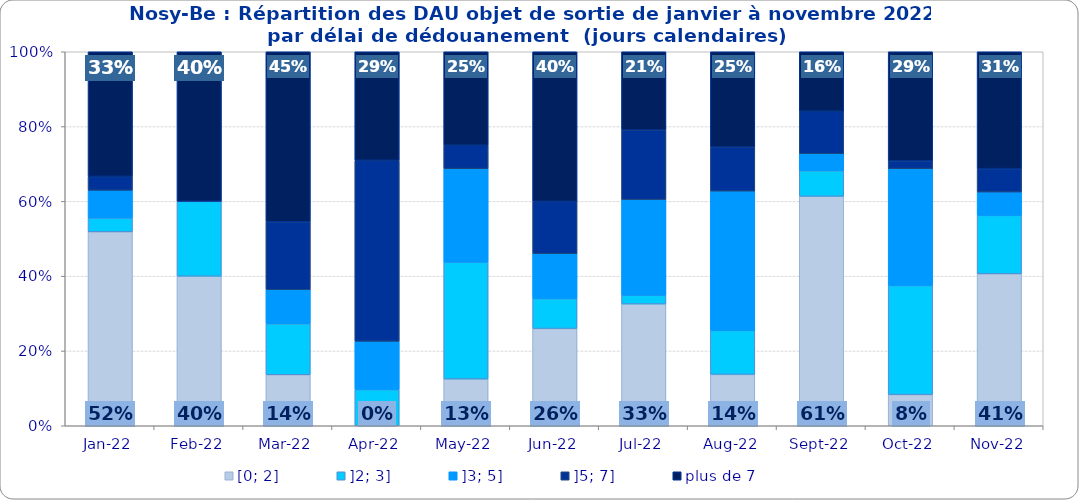
| Category | [0; 2] | ]2; 3] | ]3; 5] | ]5; 7] | plus de 7 |
|---|---|---|---|---|---|
| 2022-01-01 | 0.519 | 0.037 | 0.074 | 0.037 | 0.333 |
| 2022-02-01 | 0.4 | 0.2 | 0 | 0 | 0.4 |
| 2022-03-01 | 0.136 | 0.136 | 0.091 | 0.182 | 0.455 |
| 2022-04-01 | 0 | 0.097 | 0.129 | 0.484 | 0.29 |
| 2022-05-01 | 0.125 | 0.312 | 0.25 | 0.062 | 0.25 |
| 2022-06-01 | 0.26 | 0.08 | 0.12 | 0.14 | 0.4 |
| 2022-07-01 | 0.326 | 0.023 | 0.256 | 0.186 | 0.209 |
| 2022-08-01 | 0.137 | 0.118 | 0.373 | 0.118 | 0.255 |
| 2022-09-01 | 0.614 | 0.068 | 0.045 | 0.114 | 0.159 |
| 2022-10-01 | 0.083 | 0.292 | 0.312 | 0.021 | 0.292 |
| 2022-11-01 | 0.406 | 0.156 | 0.062 | 0.062 | 0.312 |